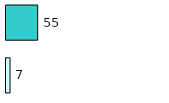
| Category | Series 0 | Series 1 |
|---|---|---|
| 0 | 7 | 55 |